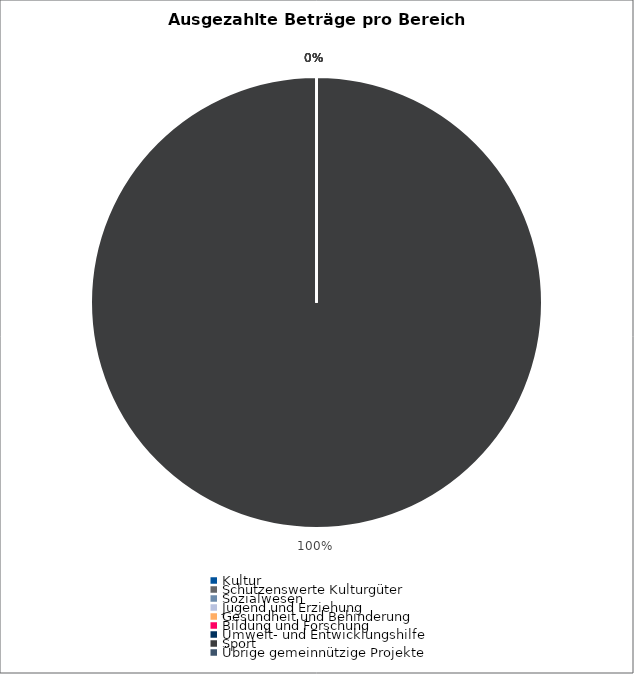
| Category | Series 0 |
|---|---|
| Kultur | 0 |
| Schützenswerte Kulturgüter | 0 |
| Sozialwesen | 0 |
| Jugend und Erziehung | 0 |
| Gesundheit und Behinderung | 0 |
| Bildung und Forschung | 0 |
| Umwelt- und Entwicklungshilfe | 0 |
| Sport | 23305998.01 |
| Übrige gemeinnützige Projekte | 0 |